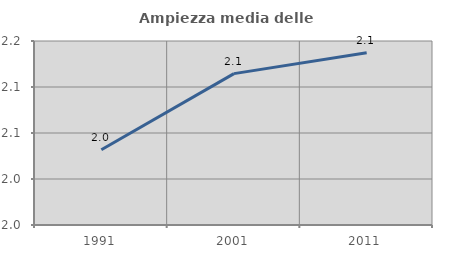
| Category | Ampiezza media delle famiglie |
|---|---|
| 1991.0 | 2.032 |
| 2001.0 | 2.115 |
| 2011.0 | 2.137 |